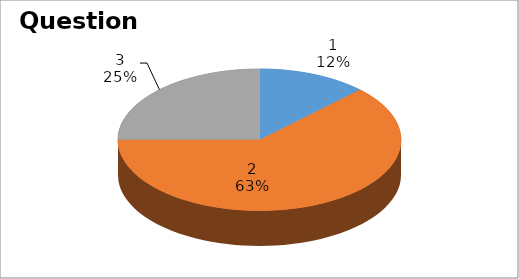
| Category | Series 0 |
|---|---|
| 0 | 1 |
| 1 | 5 |
| 2 | 2 |